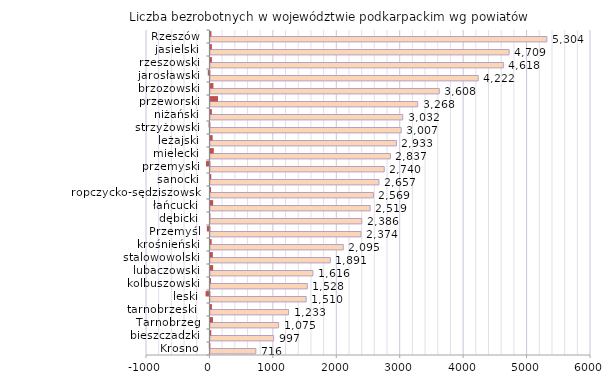
| Category | Liczba bezrobotnych w województwie podkarpackim wg powiatów | wzrost/spadek do miesiąca poprzedniego |
|---|---|---|
| Krosno | 716 | -9 |
| bieszczadzki | 997 | 13 |
| Tarnobrzeg | 1075 | 40 |
| tarnobrzeski  | 1233 | 24 |
| leski | 1510 | -61 |
| kolbuszowski | 1528 | 9 |
| lubaczowski | 1616 | 43 |
| stalowowolski | 1891 | 38 |
| krośnieński | 2095 | 19 |
| Przemyśl | 2374 | -41 |
| dębicki | 2386 | -7 |
| łańcucki | 2519 | 43 |
| ropczycko-sędziszowski | 2569 | 10 |
| sanocki | 2657 | 13 |
| przemyski | 2740 | -54 |
| mielecki | 2837 | 53 |
| leżajski | 2933 | 35 |
| strzyżowski | 3007 | -13 |
| niżański | 3032 | 23 |
| przeworski | 3268 | 119 |
| brzozowski | 3608 | 47 |
| jarosławski | 4222 | -26 |
| rzeszowski | 4618 | 23 |
| jasielski | 4709 | 23 |
| Rzeszów | 5304 | 16 |